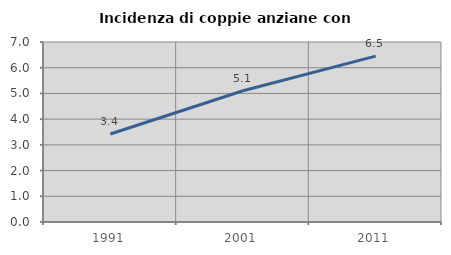
| Category | Incidenza di coppie anziane con figli |
|---|---|
| 1991.0 | 3.424 |
| 2001.0 | 5.104 |
| 2011.0 | 6.452 |